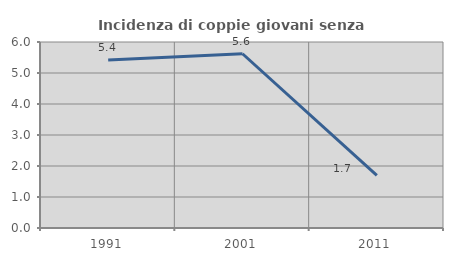
| Category | Incidenza di coppie giovani senza figli |
|---|---|
| 1991.0 | 5.419 |
| 2001.0 | 5.621 |
| 2011.0 | 1.695 |